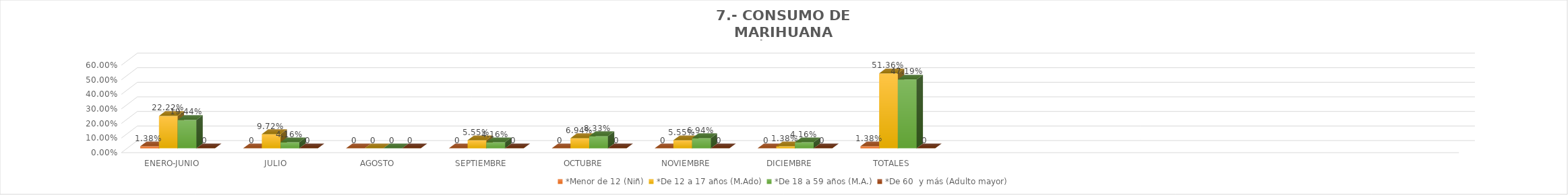
| Category | *Menor de 12 (Niñ) | *De 12 a 17 años (M.Ado) | *De 18 a 59 años (M.A.) | *De 60  y más (Adulto mayor) |
|---|---|---|---|---|
| ENERO-JUNIO | 0.014 | 0.222 | 0.194 | 0 |
| JULIO | 0 | 0.097 | 0.042 | 0 |
| AGOSTO | 0 | 0 | 0 | 0 |
| SEPTIEMBRE | 0 | 0.056 | 0.042 | 0 |
| OCTUBRE | 0 | 0.069 | 0.083 | 0 |
| NOVIEMBRE | 0 | 0.056 | 0.069 | 0 |
| DICIEMBRE | 0 | 0.014 | 0.042 | 0 |
| TOTALES | 0.014 | 0.514 | 0.472 | 0 |